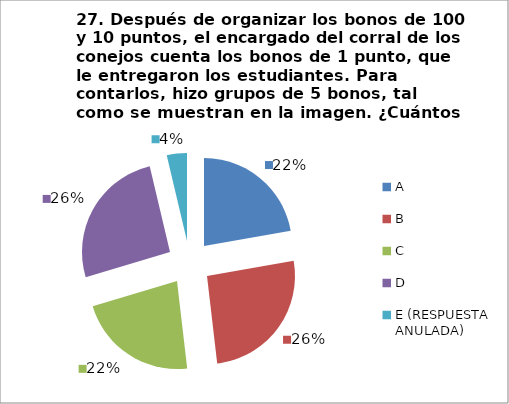
| Category | CANTIDAD DE RESPUESTAS PREGUNTA (27) | PORCENTAJE |
|---|---|---|
| A | 6 | 0.222 |
| B | 7 | 0.259 |
| C | 6 | 0.222 |
| D | 7 | 0.259 |
| E (RESPUESTA ANULADA) | 1 | 0.037 |